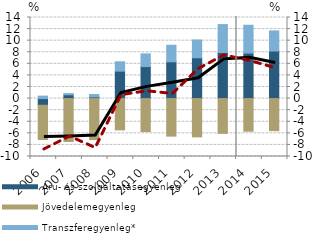
| Category | Áru- és szolgáltatásegyenleg | Jövedelemegyenleg | Transzferegyenleg* |
|---|---|---|---|
| 2006.0 | -1.153 | -5.911 | 0.424 |
| 2007.0 | 0.656 | -7.413 | 0.206 |
| 2008.0 | 0.293 | -7.088 | 0.414 |
| 2009.0 | 4.738 | -5.403 | 1.616 |
| 2010.0 | 5.525 | -5.7 | 2.196 |
| 2011.0 | 6.351 | -6.48 | 2.861 |
| 2012.0 | 7.048 | -6.61 | 3.071 |
| 2013.0 | 7.954 | -6.001 | 4.822 |
| 2014.0 | 7.858 | -5.632 | 4.802 |
| 2015.0 | 8.202 | -5.541 | 3.491 |